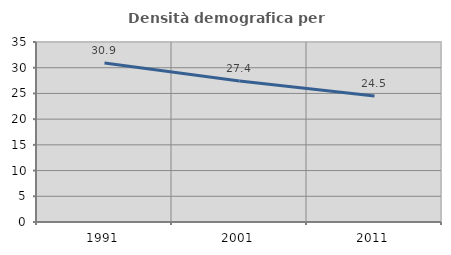
| Category | Densità demografica |
|---|---|
| 1991.0 | 30.932 |
| 2001.0 | 27.42 |
| 2011.0 | 24.501 |